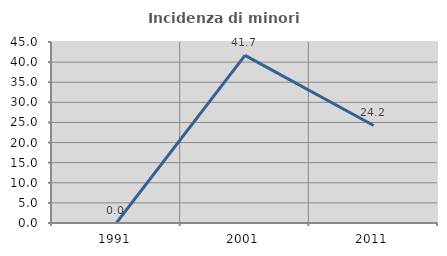
| Category | Incidenza di minori stranieri |
|---|---|
| 1991.0 | 0 |
| 2001.0 | 41.667 |
| 2011.0 | 24.242 |